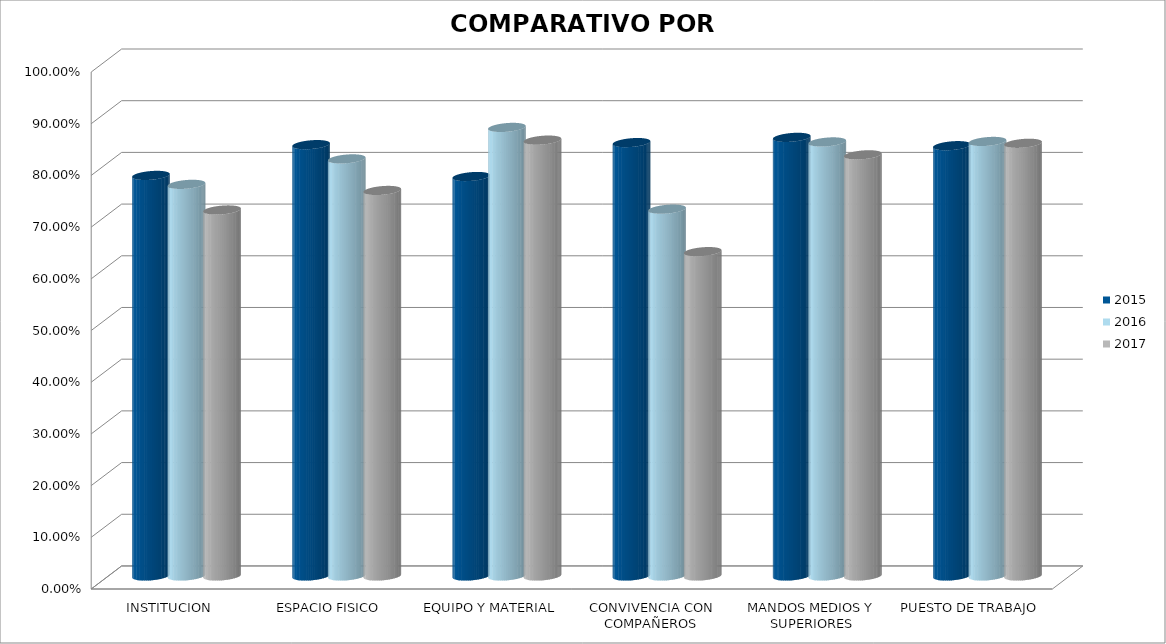
| Category | 2015 | 2016 | 2017 |
|---|---|---|---|
| INSTITUCION | 0.775 | 0.758 | 0.708 |
| ESPACIO FISICO | 0.834 | 0.807 | 0.746 |
| EQUIPO Y MATERIAL | 0.773 | 0.868 | 0.843 |
| CONVIVENCIA CON COMPAÑEROS | 0.838 | 0.71 | 0.627 |
| MANDOS MEDIOS Y SUPERIORES | 0.848 | 0.84 | 0.815 |
| PUESTO DE TRABAJO | 0.832 | 0.841 | 0.837 |